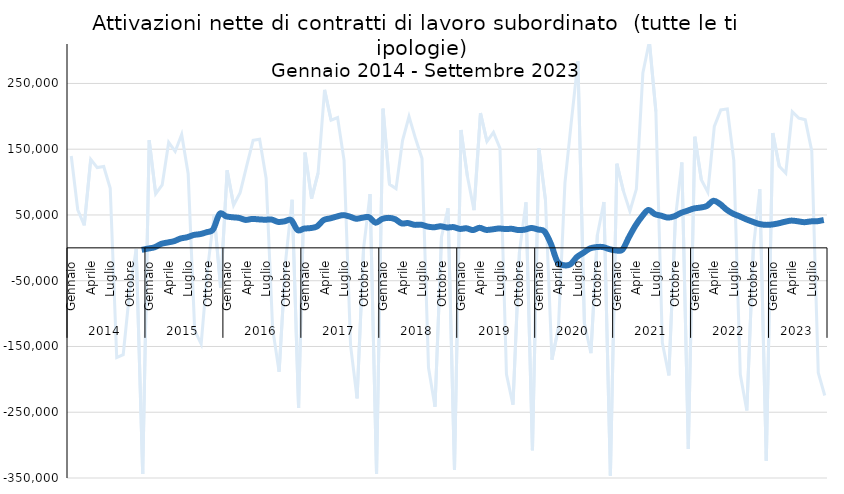
| Category | Totale |
|---|---|
| 0 | 139628 |
| 1 | 57949 |
| 2 | 34310 |
| 3 | 134731 |
| 4 | 122090 |
| 5 | 123706 |
| 6 | 90604 |
| 7 | -166783 |
| 8 | -162426 |
| 9 | -65241 |
| 10 | -1718 |
| 11 | -343901 |
| 12 | 163590 |
| 13 | 82184 |
| 14 | 95555 |
| 15 | 160301 |
| 16 | 146560 |
| 17 | 172411 |
| 18 | 112839 |
| 19 | -125590 |
| 20 | -146036 |
| 21 | -30838 |
| 22 | 50563 |
| 23 | -60843 |
| 24 | 117820 |
| 25 | 64994 |
| 26 | 83872 |
| 27 | 124378 |
| 28 | 163540 |
| 29 | 165270 |
| 30 | 105964 |
| 31 | -122591 |
| 32 | -188469 |
| 33 | -20317 |
| 34 | 73040 |
| 35 | -243550 |
| 36 | 144797 |
| 37 | 75031 |
| 38 | 113718 |
| 39 | 240156 |
| 40 | 194207 |
| 41 | 198227 |
| 42 | 133069 |
| 43 | -148255 |
| 44 | -228823 |
| 45 | -1169 |
| 46 | 81804 |
| 47 | -343720 |
| 48 | 211604 |
| 49 | 96571 |
| 50 | 90125 |
| 51 | 163002 |
| 52 | 199617 |
| 53 | 166210 |
| 54 | 135762 |
| 55 | -182402 |
| 56 | -241726 |
| 57 | 16535 |
| 58 | 60199 |
| 59 | -337591 |
| 60 | 179117 |
| 61 | 107938 |
| 62 | 57363 |
| 63 | 205010 |
| 64 | 161683 |
| 65 | 175501 |
| 66 | 151510 |
| 67 | -192261 |
| 68 | -238365 |
| 69 | -5962 |
| 70 | 69168 |
| 71 | -307921 |
| 72 | 151126 |
| 73 | 73307 |
| 74 | -170012 |
| 75 | -121529 |
| 76 | 98411 |
| 77 | 193098 |
| 78 | 283531 |
| 79 | -114749 |
| 80 | -160181 |
| 81 | 19630 |
| 82 | 69814 |
| 83 | -346346 |
| 84 | 127921 |
| 85 | 86565 |
| 86 | 55827 |
| 87 | 89404 |
| 88 | 265952 |
| 89 | 313920 |
| 90 | 207611 |
| 91 | -144378 |
| 92 | -193927 |
| 93 | 44106 |
| 94 | 129771 |
| 95 | -305748 |
| 96 | 168980 |
| 97 | 103454 |
| 98 | 84601 |
| 99 | 184737 |
| 100 | 209793 |
| 101 | 211352 |
| 102 | 132961 |
| 103 | -192762 |
| 104 | -247194 |
| 105 | -1513 |
| 106 | 89207 |
| 107 | -323863 |
| 108 | 174463 |
| 109 | 124144 |
| 110 | 113717 |
| 111 | 206930 |
| 112 | 197395 |
| 113 | 194844 |
| 114 | 147403 |
| 115 | -189894 |
| 116 | -224519 |